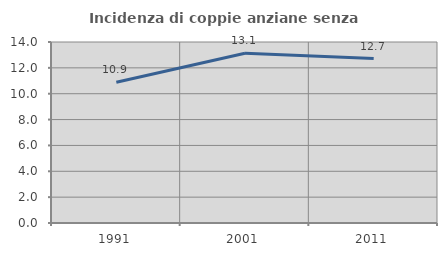
| Category | Incidenza di coppie anziane senza figli  |
|---|---|
| 1991.0 | 10.881 |
| 2001.0 | 13.126 |
| 2011.0 | 12.719 |